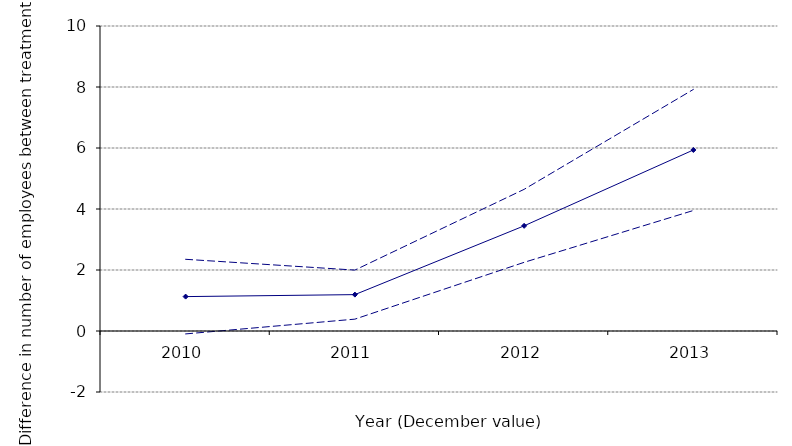
| Category | MeanDiff | FivePercent | NinetyFivePercent |
|---|---|---|---|
| 2010.0 | 1.128 | -0.096 | 2.351 |
| 2011.0 | 1.193 | 0.389 | 1.997 |
| 2012.0 | 3.448 | 2.251 | 4.645 |
| 2013.0 | 5.936 | 3.951 | 7.92 |